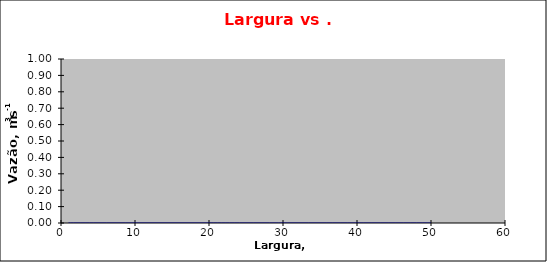
| Category | Vazão, m3s-1 |
|---|---|
| 1.0 | 0 |
| 5.0 | 0 |
| 10.0 | 0 |
| 15.0 | 0 |
| 20.0 | 0 |
| 25.0 | 0 |
| 35.0 | 0 |
| 50.0 | 0 |